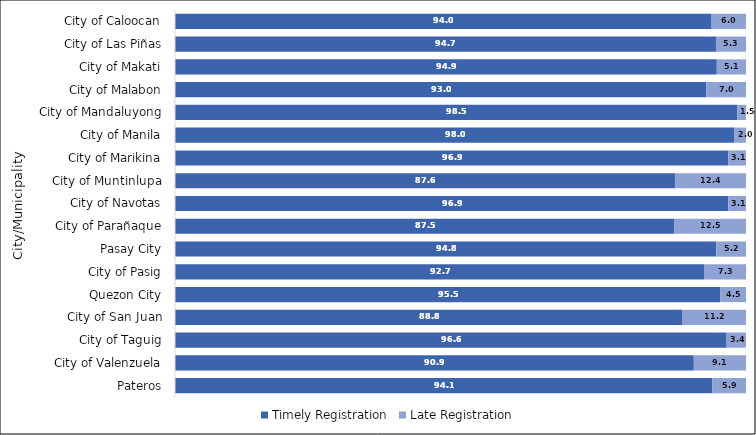
| Category | Timely Registration | Late Registration |
|---|---|---|
|  Pateros | 94.075 | 5.925 |
|  City of Valenzuela | 90.863 | 9.137 |
|  City of Taguig | 96.606 | 3.394 |
|  City of San Juan | 88.792 | 11.208 |
|  Quezon City | 95.459 | 4.541 |
|  City of Pasig | 92.651 | 7.349 |
|  Pasay City | 94.804 | 5.196 |
|  City of Parañaque | 87.488 | 12.512 |
|  City of Navotas | 96.886 | 3.114 |
|  City of Muntinlupa | 87.56 | 12.44 |
|  City of Marikina | 96.922 | 3.078 |
|  City of Manila | 97.987 | 2.013 |
|  City of Mandaluyong | 98.452 | 1.548 |
|  City of Malabon | 93.022 | 6.978 |
|  City of Makati | 94.887 | 5.113 |
|  City of Las Piñas | 94.739 | 5.261 |
|  City of Caloocan | 93.974 | 6.026 |